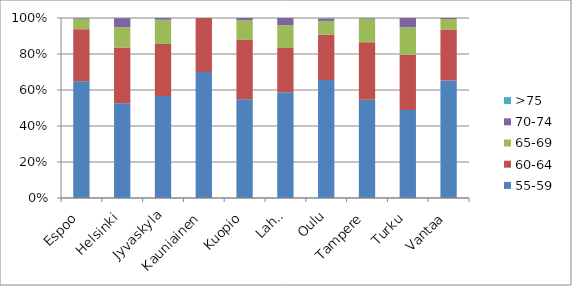
| Category | 55-59 | 60-64 | 65-69 | 70-74 | >75 |
|---|---|---|---|---|---|
| Espoo | 35700 | 15900 | 3200 | 200 | 0 |
| Helsinki | 85800 | 50700 | 18400 | 8200 | 100 |
| Jyvaskyla | 17300 | 8800 | 4100 | 300 | 0 |
| Kauniainen | 1400 | 600 | 0 | 0 | 0 |
| Kuopio | 17600 | 10600 | 3500 | 400 | 0 |
| Lahti | 13400 | 5600 | 2900 | 900 | 0 |
| Oulu | 24300 | 9400 | 2800 | 500 | 100 |
| Tampere | 19100 | 11200 | 4600 | 100 | 0 |
| Turku | 24500 | 15400 | 7600 | 2600 | 0 |
| Vantaa | 35700 | 15500 | 3200 | 300 | 0 |